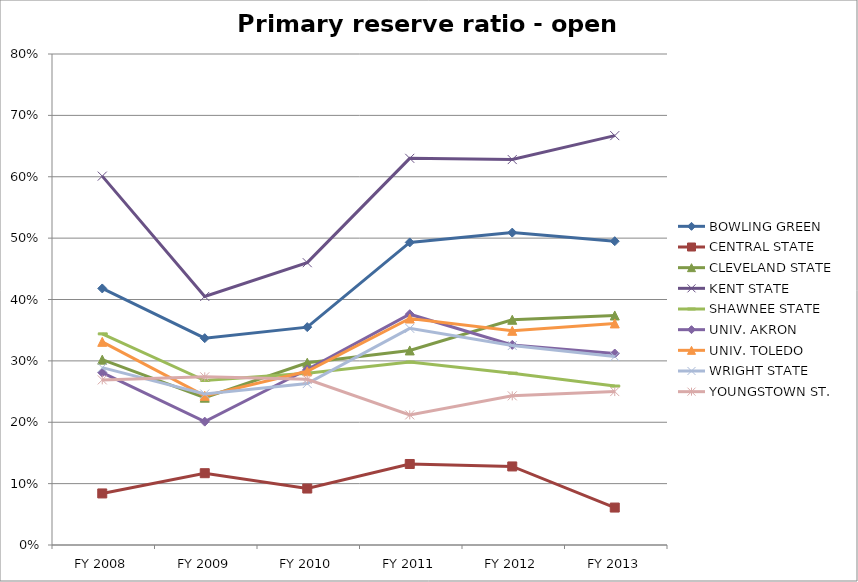
| Category | BOWLING GREEN  | CENTRAL STATE  | CLEVELAND STATE  | KENT STATE  | SHAWNEE STATE  | UNIV. AKRON  | UNIV. TOLEDO  | WRIGHT STATE  | YOUNGSTOWN ST.  |
|---|---|---|---|---|---|---|---|---|---|
| FY 2013 | 0.495 | 0.061 | 0.374 | 0.667 | 0.259 | 0.312 | 0.361 | 0.307 | 0.25 |
| FY 2012 | 0.509 | 0.128 | 0.367 | 0.628 | 0.28 | 0.326 | 0.349 | 0.325 | 0.243 |
| FY 2011 | 0.493 | 0.132 | 0.317 | 0.63 | 0.298 | 0.376 | 0.369 | 0.353 | 0.212 |
| FY 2010 | 0.355 | 0.092 | 0.297 | 0.46 | 0.28 | 0.286 | 0.283 | 0.263 | 0.27 |
| FY 2009 | 0.337 | 0.117 | 0.24 | 0.405 | 0.268 | 0.201 | 0.243 | 0.246 | 0.274 |
| FY 2008 | 0.418 | 0.084 | 0.302 | 0.601 | 0.344 | 0.281 | 0.331 | 0.289 | 0.269 |